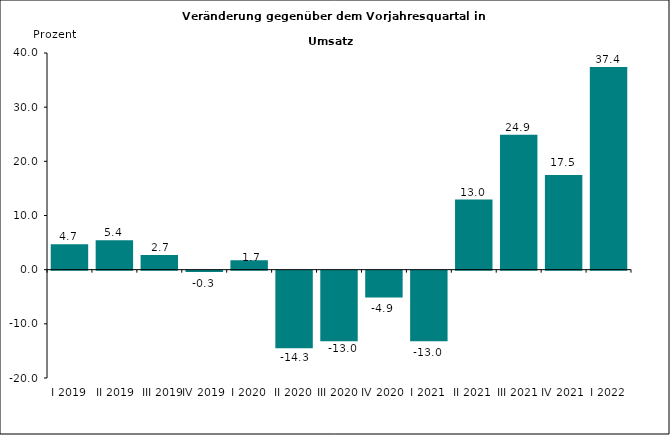
| Category | Series 0 |
|---|---|
| I 2019 | 4.714 |
|  II 2019 | 5.422 |
|  III 2019 | 2.73 |
| IV 2019 | -0.265 |
| I 2020 | 1.721 |
| II 2020 | -14.324 |
| III 2020 | -13.033 |
| IV 2020 | -4.938 |
| I 2021 | -13.038 |
| II 2021 | 12.95 |
| III 2021 | 24.9 |
| IV 2021 | 17.5 |
| I 2022 | 37.4 |